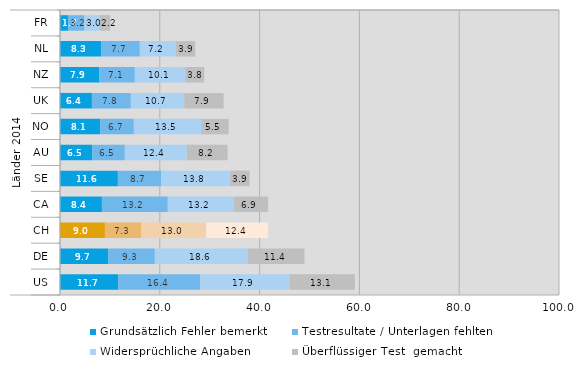
| Category | Grundsätzlich Fehler bemerkt | Testresultate / Unterlagen fehlten | Widersprüchliche Angaben | Überflüssiger Test  gemacht |
|---|---|---|---|---|
| 0 | 1.7 | 3.2 | 3 | 2.2 |
| 1 | 8.3 | 7.7 | 7.2 | 3.9 |
| 2 | 7.9 | 7.1 | 10.1 | 3.8 |
| 3 | 6.4 | 7.8 | 10.7 | 7.9 |
| 4 | 8.1 | 6.7 | 13.5 | 5.5 |
| 5 | 6.5 | 6.5 | 12.4 | 8.2 |
| 6 | 11.6 | 8.7 | 13.8 | 3.9 |
| 7 | 8.4 | 13.2 | 13.2 | 6.9 |
| 8 | 9 | 7.3 | 13 | 12.4 |
| 9 | 9.7 | 9.3 | 18.6 | 11.4 |
| 10 | 11.7 | 16.4 | 17.9 | 13.1 |